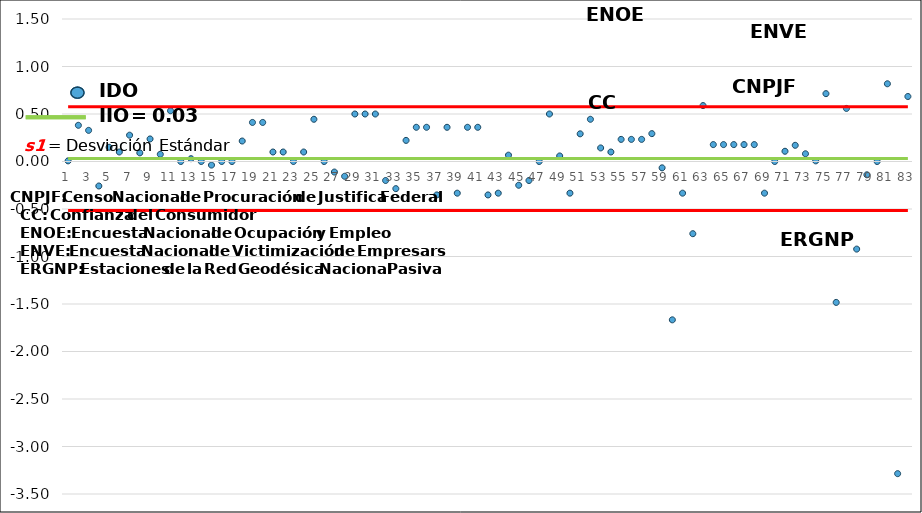
| Category | Series 0 | Series 1 | Series 2 | Series 3 |
|---|---|---|---|---|
| 0 | 0.007 | 0.031 | 0.576 | -0.515 |
| 1 | 0.381 | 0.031 | 0.576 | -0.515 |
| 2 | 0.328 | 0.031 | 0.576 | -0.515 |
| 3 | -0.258 | 0.031 | 0.576 | -0.515 |
| 4 | 0.15 | 0.031 | 0.576 | -0.515 |
| 5 | 0.1 | 0.031 | 0.576 | -0.515 |
| 6 | 0.277 | 0.031 | 0.576 | -0.515 |
| 7 | 0.091 | 0.031 | 0.576 | -0.515 |
| 8 | 0.237 | 0.031 | 0.576 | -0.515 |
| 9 | 0.076 | 0.031 | 0.576 | -0.515 |
| 10 | 0.534 | 0.031 | 0.576 | -0.515 |
| 11 | 0 | 0.031 | 0.576 | -0.515 |
| 12 | 0.029 | 0.031 | 0.576 | -0.515 |
| 13 | 0 | 0.031 | 0.576 | -0.515 |
| 14 | -0.038 | 0.031 | 0.576 | -0.515 |
| 15 | 0 | 0.031 | 0.576 | -0.515 |
| 16 | 0 | 0.031 | 0.576 | -0.515 |
| 17 | 0.216 | 0.031 | 0.576 | -0.515 |
| 18 | 0.411 | 0.031 | 0.576 | -0.515 |
| 19 | 0.411 | 0.031 | 0.576 | -0.515 |
| 20 | 0.1 | 0.031 | 0.576 | -0.515 |
| 21 | 0.1 | 0.031 | 0.576 | -0.515 |
| 22 | 0 | 0.031 | 0.576 | -0.515 |
| 23 | 0.1 | 0.031 | 0.576 | -0.515 |
| 24 | 0.444 | 0.031 | 0.576 | -0.515 |
| 25 | 0 | 0.031 | 0.576 | -0.515 |
| 26 | -0.111 | 0.031 | 0.576 | -0.515 |
| 27 | -0.156 | 0.031 | 0.576 | -0.515 |
| 28 | 0.5 | 0.031 | 0.576 | -0.515 |
| 29 | 0.5 | 0.031 | 0.576 | -0.515 |
| 30 | 0.5 | 0.031 | 0.576 | -0.515 |
| 31 | -0.2 | 0.031 | 0.576 | -0.515 |
| 32 | -0.286 | 0.031 | 0.576 | -0.515 |
| 33 | 0.222 | 0.031 | 0.576 | -0.515 |
| 34 | 0.36 | 0.031 | 0.576 | -0.515 |
| 35 | 0.36 | 0.031 | 0.576 | -0.515 |
| 36 | -0.352 | 0.031 | 0.576 | -0.515 |
| 37 | 0.36 | 0.031 | 0.576 | -0.515 |
| 38 | -0.333 | 0.031 | 0.576 | -0.515 |
| 39 | 0.36 | 0.031 | 0.576 | -0.515 |
| 40 | 0.36 | 0.031 | 0.576 | -0.515 |
| 41 | -0.352 | 0.031 | 0.576 | -0.515 |
| 42 | -0.333 | 0.031 | 0.576 | -0.515 |
| 43 | 0.067 | 0.031 | 0.576 | -0.515 |
| 44 | -0.25 | 0.031 | 0.576 | -0.515 |
| 45 | -0.2 | 0.031 | 0.576 | -0.515 |
| 46 | 0 | 0.031 | 0.576 | -0.515 |
| 47 | 0.5 | 0.031 | 0.576 | -0.515 |
| 48 | 0.059 | 0.031 | 0.576 | -0.515 |
| 49 | -0.333 | 0.031 | 0.576 | -0.515 |
| 50 | 0.291 | 0.031 | 0.576 | -0.515 |
| 51 | 0.444 | 0.031 | 0.576 | -0.515 |
| 52 | 0.143 | 0.031 | 0.576 | -0.515 |
| 53 | 0.1 | 0.031 | 0.576 | -0.515 |
| 54 | 0.233 | 0.031 | 0.576 | -0.515 |
| 55 | 0.233 | 0.031 | 0.576 | -0.515 |
| 56 | 0.233 | 0.031 | 0.576 | -0.515 |
| 57 | 0.293 | 0.031 | 0.576 | -0.515 |
| 58 | -0.067 | 0.031 | 0.576 | -0.515 |
| 59 | -1.667 | 0.031 | 0.576 | -0.515 |
| 60 | -0.333 | 0.031 | 0.576 | -0.515 |
| 61 | -0.76 | 0.031 | 0.576 | -0.515 |
| 62 | 0.589 | 0.031 | 0.576 | -0.515 |
| 63 | 0.178 | 0.031 | 0.576 | -0.515 |
| 64 | 0.178 | 0.031 | 0.576 | -0.515 |
| 65 | 0.178 | 0.031 | 0.576 | -0.515 |
| 66 | 0.178 | 0.031 | 0.576 | -0.515 |
| 67 | 0.178 | 0.031 | 0.576 | -0.515 |
| 68 | -0.333 | 0.031 | 0.576 | -0.515 |
| 69 | 0 | 0.031 | 0.576 | -0.515 |
| 70 | 0.108 | 0.031 | 0.576 | -0.515 |
| 71 | 0.17 | 0.031 | 0.576 | -0.515 |
| 72 | 0.081 | 0.031 | 0.576 | -0.515 |
| 73 | 0.007 | 0.031 | 0.576 | -0.515 |
| 74 | 0.714 | 0.031 | 0.576 | -0.515 |
| 75 | -1.483 | 0.031 | 0.576 | -0.515 |
| 76 | 0.559 | 0.031 | 0.576 | -0.515 |
| 77 | -0.922 | 0.031 | 0.576 | -0.515 |
| 78 | -0.14 | 0.031 | 0.576 | -0.515 |
| 79 | 0 | 0.031 | 0.576 | -0.515 |
| 80 | 0.818 | 0.031 | 0.576 | -0.515 |
| 81 | -3.286 | 0.031 | 0.576 | -0.515 |
| 82 | 0.684 | 0.031 | 0.576 | -0.515 |